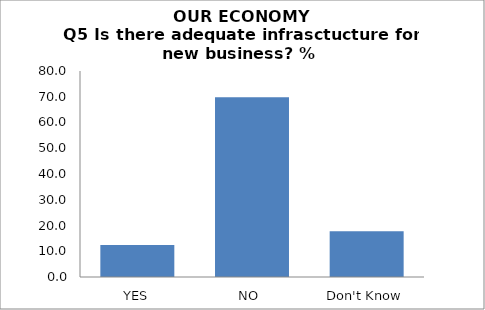
| Category | Series 0 |
|---|---|
| YES | 12.465 |
| NO  | 69.806 |
| Don't Know | 17.729 |